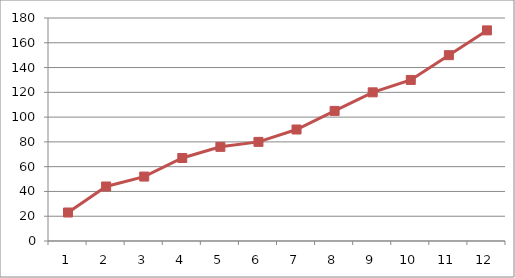
| Category | Series 1 |
|---|---|
| 1.0 | 23 |
| 2.0 | 44 |
| 3.0 | 52 |
| 4.0 | 67 |
| 5.0 | 76 |
| 6.0 | 80 |
| 7.0 | 90 |
| 8.0 | 105 |
| 9.0 | 120 |
| 10.0 | 130 |
| 11.0 | 150 |
| 12.0 | 170 |